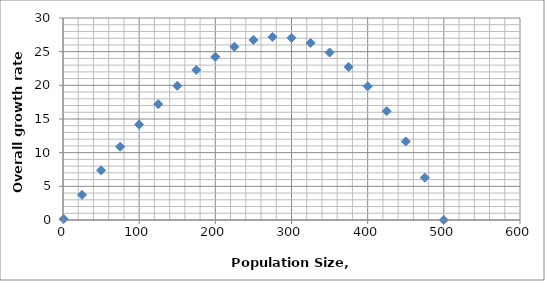
| Category | overall growth rate |
|---|---|
| 1.0 | 0.15 |
| 25.0 | 3.733 |
| 50.0 | 7.381 |
| 75.0 | 10.88 |
| 100.0 | 14.172 |
| 125.0 | 17.204 |
| 150.0 | 19.924 |
| 175.0 | 22.283 |
| 200.0 | 24.235 |
| 225.0 | 25.732 |
| 250.0 | 26.731 |
| 275.0 | 27.187 |
| 300.0 | 27.057 |
| 325.0 | 26.3 |
| 350.0 | 24.873 |
| 375.0 | 22.735 |
| 400.0 | 19.847 |
| 425.0 | 16.169 |
| 450.0 | 11.661 |
| 475.0 | 6.284 |
| 500.0 | 0 |